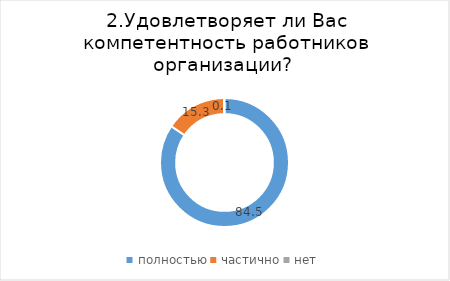
| Category | Series 0 |
|---|---|
| полностью | 84.539 |
| частично | 15.337 |
| нет | 0.124 |